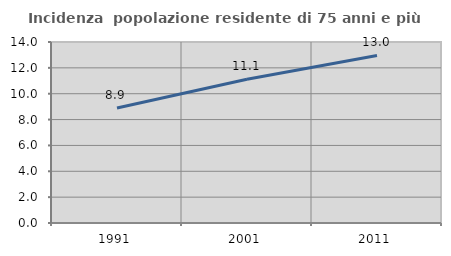
| Category | Incidenza  popolazione residente di 75 anni e più |
|---|---|
| 1991.0 | 8.889 |
| 2001.0 | 11.119 |
| 2011.0 | 12.958 |